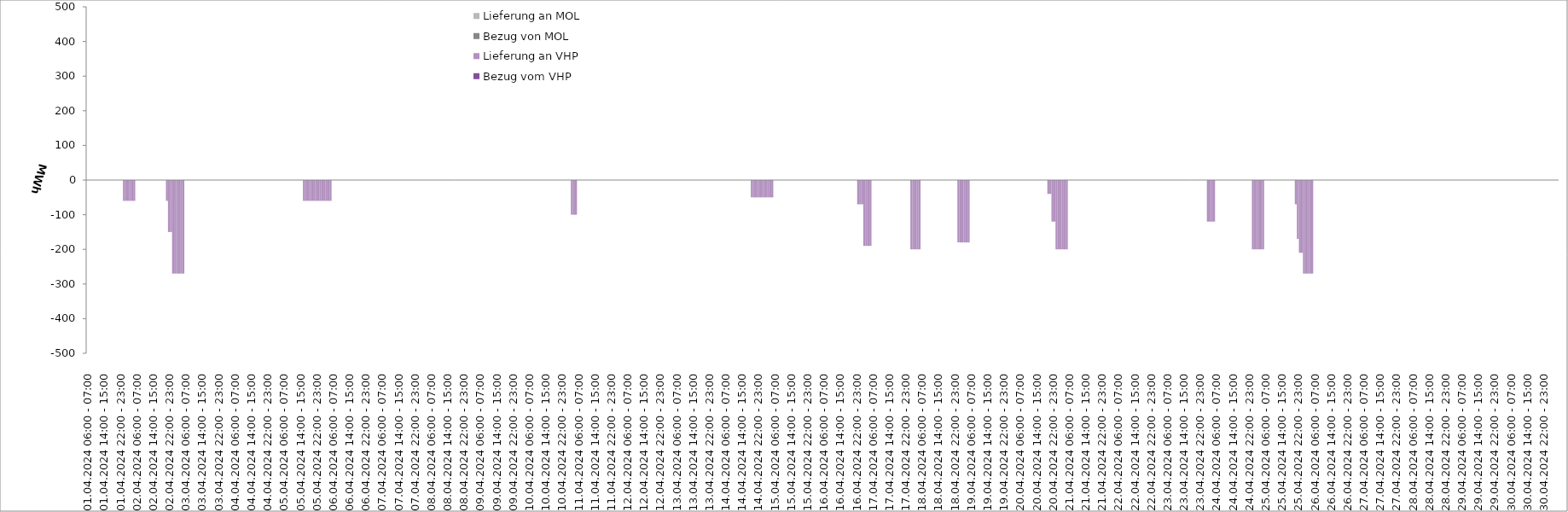
| Category | Bezug vom VHP | Lieferung an VHP | Bezug von MOL | Lieferung an MOL |
|---|---|---|---|---|
| 01.04.2024 06:00 - 07:00 | 0 | 0 | 0 | 0 |
| 01.04.2024 07:00 - 08:00 | 0 | 0 | 0 | 0 |
| 01.04.2024 08:00 - 09:00 | 0 | 0 | 0 | 0 |
| 01.04.2024 09:00 - 10:00 | 0 | 0 | 0 | 0 |
| 01.04.2024 10:00 - 11:00 | 0 | 0 | 0 | 0 |
| 01.04.2024 11:00 - 12:00 | 0 | 0 | 0 | 0 |
| 01.04.2024 12:00 - 13:00 | 0 | 0 | 0 | 0 |
| 01.04.2024 13:00 - 14:00 | 0 | 0 | 0 | 0 |
| 01.04.2024 14:00 - 15:00 | 0 | 0 | 0 | 0 |
| 01.04.2024 15:00 - 16:00 | 0 | 0 | 0 | 0 |
| 01.04.2024 16:00 - 17:00 | 0 | 0 | 0 | 0 |
| 01.04.2024 17:00 - 18:00 | 0 | 0 | 0 | 0 |
| 01.04.2024 18:00 - 19:00 | 0 | 0 | 0 | 0 |
| 01.04.2024 19:00 - 20:00 | 0 | 0 | 0 | 0 |
| 01.04.2024 20:00 - 21:00 | 0 | 0 | 0 | 0 |
| 01.04.2024 21:00 - 22:00 | 0 | 0 | 0 | 0 |
| 01.04.2024 22:00 - 23:00 | 0 | 0 | 0 | 0 |
| 01.04.2024 23:00 - 24:00 | 0 | 0 | 0 | 0 |
| 02.04.2024 00:00 - 01:00 | 0 | -60 | 0 | 0 |
| 02.04.2024 01:00 - 02:00 | 0 | -60 | 0 | 0 |
| 02.04.2024 02:00 - 03:00 | 0 | -60 | 0 | 0 |
| 02.04.2024 03:00 - 04:00 | 0 | -60 | 0 | 0 |
| 02.04.2024 04:00 - 05:00 | 0 | -60 | 0 | 0 |
| 02.04.2024 05:00 - 06:00 | 0 | -60 | 0 | 0 |
| 02.04.2024 06:00 - 07:00 | 0 | 0 | 0 | 0 |
| 02.04.2024 07:00 - 08:00 | 0 | 0 | 0 | 0 |
| 02.04.2024 08:00 - 09:00 | 0 | 0 | 0 | 0 |
| 02.04.2024 09:00 - 10:00 | 0 | 0 | 0 | 0 |
| 02.04.2024 10:00 - 11:00 | 0 | 0 | 0 | 0 |
| 02.04.2024 11:00 - 12:00 | 0 | 0 | 0 | 0 |
| 02.04.2024 12:00 - 13:00 | 0 | 0 | 0 | 0 |
| 02.04.2024 13:00 - 14:00 | 0 | 0 | 0 | 0 |
| 02.04.2024 14:00 - 15:00 | 0 | 0 | 0 | 0 |
| 02.04.2024 15:00 - 16:00 | 0 | 0 | 0 | 0 |
| 02.04.2024 16:00 - 17:00 | 0 | 0 | 0 | 0 |
| 02.04.2024 17:00 - 18:00 | 0 | 0 | 0 | 0 |
| 02.04.2024 18:00 - 19:00 | 0 | 0 | 0 | 0 |
| 02.04.2024 19:00 - 20:00 | 0 | 0 | 0 | 0 |
| 02.04.2024 20:00 - 21:00 | 0 | 0 | 0 | 0 |
| 02.04.2024 21:00 - 22:00 | 0 | -60 | 0 | 0 |
| 02.04.2024 22:00 - 23:00 | 0 | -150 | 0 | 0 |
| 02.04.2024 23:00 - 24:00 | 0 | -150 | 0 | 0 |
| 03.04.2024 00:00 - 01:00 | 0 | -270 | 0 | 0 |
| 03.04.2024 01:00 - 02:00 | 0 | -270 | 0 | 0 |
| 03.04.2024 02:00 - 03:00 | 0 | -270 | 0 | 0 |
| 03.04.2024 03:00 - 04:00 | 0 | -270 | 0 | 0 |
| 03.04.2024 04:00 - 05:00 | 0 | -270 | 0 | 0 |
| 03.04.2024 05:00 - 06:00 | 0 | -270 | 0 | 0 |
| 03.04.2024 06:00 - 07:00 | 0 | 0 | 0 | 0 |
| 03.04.2024 07:00 - 08:00 | 0 | 0 | 0 | 0 |
| 03.04.2024 08:00 - 09:00 | 0 | 0 | 0 | 0 |
| 03.04.2024 09:00 - 10:00 | 0 | 0 | 0 | 0 |
| 03.04.2024 10:00 - 11:00 | 0 | 0 | 0 | 0 |
| 03.04.2024 11:00 - 12:00 | 0 | 0 | 0 | 0 |
| 03.04.2024 12:00 - 13:00 | 0 | 0 | 0 | 0 |
| 03.04.2024 13:00 - 14:00 | 0 | 0 | 0 | 0 |
| 03.04.2024 14:00 - 15:00 | 0 | 0 | 0 | 0 |
| 03.04.2024 15:00 - 16:00 | 0 | 0 | 0 | 0 |
| 03.04.2024 16:00 - 17:00 | 0 | 0 | 0 | 0 |
| 03.04.2024 17:00 - 18:00 | 0 | 0 | 0 | 0 |
| 03.04.2024 18:00 - 19:00 | 0 | 0 | 0 | 0 |
| 03.04.2024 19:00 - 20:00 | 0 | 0 | 0 | 0 |
| 03.04.2024 20:00 - 21:00 | 0 | 0 | 0 | 0 |
| 03.04.2024 21:00 - 22:00 | 0 | 0 | 0 | 0 |
| 03.04.2024 22:00 - 23:00 | 0 | 0 | 0 | 0 |
| 03.04.2024 23:00 - 24:00 | 0 | 0 | 0 | 0 |
| 04.04.2024 00:00 - 01:00 | 0 | 0 | 0 | 0 |
| 04.04.2024 01:00 - 02:00 | 0 | 0 | 0 | 0 |
| 04.04.2024 02:00 - 03:00 | 0 | 0 | 0 | 0 |
| 04.04.2024 03:00 - 04:00 | 0 | 0 | 0 | 0 |
| 04.04.2024 04:00 - 05:00 | 0 | 0 | 0 | 0 |
| 04.04.2024 05:00 - 06:00 | 0 | 0 | 0 | 0 |
| 04.04.2024 06:00 - 07:00 | 0 | 0 | 0 | 0 |
| 04.04.2024 07:00 - 08:00 | 0 | 0 | 0 | 0 |
| 04.04.2024 08:00 - 09:00 | 0 | 0 | 0 | 0 |
| 04.04.2024 09:00 - 10:00 | 0 | 0 | 0 | 0 |
| 04.04.2024 10:00 - 11:00 | 0 | 0 | 0 | 0 |
| 04.04.2024 11:00 - 12:00 | 0 | 0 | 0 | 0 |
| 04.04.2024 12:00 - 13:00 | 0 | 0 | 0 | 0 |
| 04.04.2024 13:00 - 14:00 | 0 | 0 | 0 | 0 |
| 04.04.2024 14:00 - 15:00 | 0 | 0 | 0 | 0 |
| 04.04.2024 15:00 - 16:00 | 0 | 0 | 0 | 0 |
| 04.04.2024 16:00 - 17:00 | 0 | 0 | 0 | 0 |
| 04.04.2024 17:00 - 18:00 | 0 | 0 | 0 | 0 |
| 04.04.2024 18:00 - 19:00 | 0 | 0 | 0 | 0 |
| 04.04.2024 19:00 - 20:00 | 0 | 0 | 0 | 0 |
| 04.04.2024 20:00 - 21:00 | 0 | 0 | 0 | 0 |
| 04.04.2024 21:00 - 22:00 | 0 | 0 | 0 | 0 |
| 04.04.2024 22:00 - 23:00 | 0 | 0 | 0 | 0 |
| 04.04.2024 23:00 - 24:00 | 0 | 0 | 0 | 0 |
| 05.04.2024 00:00 - 01:00 | 0 | 0 | 0 | 0 |
| 05.04.2024 01:00 - 02:00 | 0 | 0 | 0 | 0 |
| 05.04.2024 02:00 - 03:00 | 0 | 0 | 0 | 0 |
| 05.04.2024 03:00 - 04:00 | 0 | 0 | 0 | 0 |
| 05.04.2024 04:00 - 05:00 | 0 | 0 | 0 | 0 |
| 05.04.2024 05:00 - 06:00 | 0 | 0 | 0 | 0 |
| 05.04.2024 06:00 - 07:00 | 0 | 0 | 0 | 0 |
| 05.04.2024 07:00 - 08:00 | 0 | 0 | 0 | 0 |
| 05.04.2024 08:00 - 09:00 | 0 | 0 | 0 | 0 |
| 05.04.2024 09:00 - 10:00 | 0 | 0 | 0 | 0 |
| 05.04.2024 10:00 - 11:00 | 0 | 0 | 0 | 0 |
| 05.04.2024 11:00 - 12:00 | 0 | 0 | 0 | 0 |
| 05.04.2024 12:00 - 13:00 | 0 | 0 | 0 | 0 |
| 05.04.2024 13:00 - 14:00 | 0 | 0 | 0 | 0 |
| 05.04.2024 14:00 - 15:00 | 0 | 0 | 0 | 0 |
| 05.04.2024 15:00 - 16:00 | 0 | 0 | 0 | 0 |
| 05.04.2024 16:00 - 17:00 | 0 | -60 | 0 | 0 |
| 05.04.2024 17:00 - 18:00 | 0 | -60 | 0 | 0 |
| 05.04.2024 18:00 - 19:00 | 0 | -60 | 0 | 0 |
| 05.04.2024 19:00 - 20:00 | 0 | -60 | 0 | 0 |
| 05.04.2024 20:00 - 21:00 | 0 | -60 | 0 | 0 |
| 05.04.2024 21:00 - 22:00 | 0 | -60 | 0 | 0 |
| 05.04.2024 22:00 - 23:00 | 0 | -60 | 0 | 0 |
| 05.04.2024 23:00 - 24:00 | 0 | -60 | 0 | 0 |
| 06.04.2024 00:00 - 01:00 | 0 | -60 | 0 | 0 |
| 06.04.2024 01:00 - 02:00 | 0 | -60 | 0 | 0 |
| 06.04.2024 02:00 - 03:00 | 0 | -60 | 0 | 0 |
| 06.04.2024 03:00 - 04:00 | 0 | -60 | 0 | 0 |
| 06.04.2024 04:00 - 05:00 | 0 | -60 | 0 | 0 |
| 06.04.2024 05:00 - 06:00 | 0 | -60 | 0 | 0 |
| 06.04.2024 06:00 - 07:00 | 0 | 0 | 0 | 0 |
| 06.04.2024 07:00 - 08:00 | 0 | 0 | 0 | 0 |
| 06.04.2024 08:00 - 09:00 | 0 | 0 | 0 | 0 |
| 06.04.2024 09:00 - 10:00 | 0 | 0 | 0 | 0 |
| 06.04.2024 10:00 - 11:00 | 0 | 0 | 0 | 0 |
| 06.04.2024 11:00 - 12:00 | 0 | 0 | 0 | 0 |
| 06.04.2024 12:00 - 13:00 | 0 | 0 | 0 | 0 |
| 06.04.2024 13:00 - 14:00 | 0 | 0 | 0 | 0 |
| 06.04.2024 14:00 - 15:00 | 0 | 0 | 0 | 0 |
| 06.04.2024 15:00 - 16:00 | 0 | 0 | 0 | 0 |
| 06.04.2024 16:00 - 17:00 | 0 | 0 | 0 | 0 |
| 06.04.2024 17:00 - 18:00 | 0 | 0 | 0 | 0 |
| 06.04.2024 18:00 - 19:00 | 0 | 0 | 0 | 0 |
| 06.04.2024 19:00 - 20:00 | 0 | 0 | 0 | 0 |
| 06.04.2024 20:00 - 21:00 | 0 | 0 | 0 | 0 |
| 06.04.2024 21:00 - 22:00 | 0 | 0 | 0 | 0 |
| 06.04.2024 22:00 - 23:00 | 0 | 0 | 0 | 0 |
| 06.04.2024 23:00 - 24:00 | 0 | 0 | 0 | 0 |
| 07.04.2024 00:00 - 01:00 | 0 | 0 | 0 | 0 |
| 07.04.2024 01:00 - 02:00 | 0 | 0 | 0 | 0 |
| 07.04.2024 02:00 - 03:00 | 0 | 0 | 0 | 0 |
| 07.04.2024 03:00 - 04:00 | 0 | 0 | 0 | 0 |
| 07.04.2024 04:00 - 05:00 | 0 | 0 | 0 | 0 |
| 07.04.2024 05:00 - 06:00 | 0 | 0 | 0 | 0 |
| 07.04.2024 06:00 - 07:00 | 0 | 0 | 0 | 0 |
| 07.04.2024 07:00 - 08:00 | 0 | 0 | 0 | 0 |
| 07.04.2024 08:00 - 09:00 | 0 | 0 | 0 | 0 |
| 07.04.2024 09:00 - 10:00 | 0 | 0 | 0 | 0 |
| 07.04.2024 10:00 - 11:00 | 0 | 0 | 0 | 0 |
| 07.04.2024 11:00 - 12:00 | 0 | 0 | 0 | 0 |
| 07.04.2024 12:00 - 13:00 | 0 | 0 | 0 | 0 |
| 07.04.2024 13:00 - 14:00 | 0 | 0 | 0 | 0 |
| 07.04.2024 14:00 - 15:00 | 0 | 0 | 0 | 0 |
| 07.04.2024 15:00 - 16:00 | 0 | 0 | 0 | 0 |
| 07.04.2024 16:00 - 17:00 | 0 | 0 | 0 | 0 |
| 07.04.2024 17:00 - 18:00 | 0 | 0 | 0 | 0 |
| 07.04.2024 18:00 - 19:00 | 0 | 0 | 0 | 0 |
| 07.04.2024 19:00 - 20:00 | 0 | 0 | 0 | 0 |
| 07.04.2024 20:00 - 21:00 | 0 | 0 | 0 | 0 |
| 07.04.2024 21:00 - 22:00 | 0 | 0 | 0 | 0 |
| 07.04.2024 22:00 - 23:00 | 0 | 0 | 0 | 0 |
| 07.04.2024 23:00 - 24:00 | 0 | 0 | 0 | 0 |
| 08.04.2024 00:00 - 01:00 | 0 | 0 | 0 | 0 |
| 08.04.2024 01:00 - 02:00 | 0 | 0 | 0 | 0 |
| 08.04.2024 02:00 - 03:00 | 0 | 0 | 0 | 0 |
| 08.04.2024 03:00 - 04:00 | 0 | 0 | 0 | 0 |
| 08.04.2024 04:00 - 05:00 | 0 | 0 | 0 | 0 |
| 08.04.2024 05:00 - 06:00 | 0 | 0 | 0 | 0 |
| 08.04.2024 06:00 - 07:00 | 0 | 0 | 0 | 0 |
| 08.04.2024 07:00 - 08:00 | 0 | 0 | 0 | 0 |
| 08.04.2024 08:00 - 09:00 | 0 | 0 | 0 | 0 |
| 08.04.2024 09:00 - 10:00 | 0 | 0 | 0 | 0 |
| 08.04.2024 10:00 - 11:00 | 0 | 0 | 0 | 0 |
| 08.04.2024 11:00 - 12:00 | 0 | 0 | 0 | 0 |
| 08.04.2024 12:00 - 13:00 | 0 | 0 | 0 | 0 |
| 08.04.2024 13:00 - 14:00 | 0 | 0 | 0 | 0 |
| 08.04.2024 14:00 - 15:00 | 0 | 0 | 0 | 0 |
| 08.04.2024 15:00 - 16:00 | 0 | 0 | 0 | 0 |
| 08.04.2024 16:00 - 17:00 | 0 | 0 | 0 | 0 |
| 08.04.2024 17:00 - 18:00 | 0 | 0 | 0 | 0 |
| 08.04.2024 18:00 - 19:00 | 0 | 0 | 0 | 0 |
| 08.04.2024 19:00 - 20:00 | 0 | 0 | 0 | 0 |
| 08.04.2024 20:00 - 21:00 | 0 | 0 | 0 | 0 |
| 08.04.2024 21:00 - 22:00 | 0 | 0 | 0 | 0 |
| 08.04.2024 22:00 - 23:00 | 0 | 0 | 0 | 0 |
| 08.04.2024 23:00 - 24:00 | 0 | 0 | 0 | 0 |
| 09.04.2024 00:00 - 01:00 | 0 | 0 | 0 | 0 |
| 09.04.2024 01:00 - 02:00 | 0 | 0 | 0 | 0 |
| 09.04.2024 02:00 - 03:00 | 0 | 0 | 0 | 0 |
| 09.04.2024 03:00 - 04:00 | 0 | 0 | 0 | 0 |
| 09.04.2024 04:00 - 05:00 | 0 | 0 | 0 | 0 |
| 09.04.2024 05:00 - 06:00 | 0 | 0 | 0 | 0 |
| 09.04.2024 06:00 - 07:00 | 0 | 0 | 0 | 0 |
| 09.04.2024 07:00 - 08:00 | 0 | 0 | 0 | 0 |
| 09.04.2024 08:00 - 09:00 | 0 | 0 | 0 | 0 |
| 09.04.2024 09:00 - 10:00 | 0 | 0 | 0 | 0 |
| 09.04.2024 10:00 - 11:00 | 0 | 0 | 0 | 0 |
| 09.04.2024 11:00 - 12:00 | 0 | 0 | 0 | 0 |
| 09.04.2024 12:00 - 13:00 | 0 | 0 | 0 | 0 |
| 09.04.2024 13:00 - 14:00 | 0 | 0 | 0 | 0 |
| 09.04.2024 14:00 - 15:00 | 0 | 0 | 0 | 0 |
| 09.04.2024 15:00 - 16:00 | 0 | 0 | 0 | 0 |
| 09.04.2024 16:00 - 17:00 | 0 | 0 | 0 | 0 |
| 09.04.2024 17:00 - 18:00 | 0 | 0 | 0 | 0 |
| 09.04.2024 18:00 - 19:00 | 0 | 0 | 0 | 0 |
| 09.04.2024 19:00 - 20:00 | 0 | 0 | 0 | 0 |
| 09.04.2024 20:00 - 21:00 | 0 | 0 | 0 | 0 |
| 09.04.2024 21:00 - 22:00 | 0 | 0 | 0 | 0 |
| 09.04.2024 22:00 - 23:00 | 0 | 0 | 0 | 0 |
| 09.04.2024 23:00 - 24:00 | 0 | 0 | 0 | 0 |
| 10.04.2024 00:00 - 01:00 | 0 | 0 | 0 | 0 |
| 10.04.2024 01:00 - 02:00 | 0 | 0 | 0 | 0 |
| 10.04.2024 02:00 - 03:00 | 0 | 0 | 0 | 0 |
| 10.04.2024 03:00 - 04:00 | 0 | 0 | 0 | 0 |
| 10.04.2024 04:00 - 05:00 | 0 | 0 | 0 | 0 |
| 10.04.2024 05:00 - 06:00 | 0 | 0 | 0 | 0 |
| 10.04.2024 06:00 - 07:00 | 0 | 0 | 0 | 0 |
| 10.04.2024 07:00 - 08:00 | 0 | 0 | 0 | 0 |
| 10.04.2024 08:00 - 09:00 | 0 | 0 | 0 | 0 |
| 10.04.2024 09:00 - 10:00 | 0 | 0 | 0 | 0 |
| 10.04.2024 10:00 - 11:00 | 0 | 0 | 0 | 0 |
| 10.04.2024 11:00 - 12:00 | 0 | 0 | 0 | 0 |
| 10.04.2024 12:00 - 13:00 | 0 | 0 | 0 | 0 |
| 10.04.2024 13:00 - 14:00 | 0 | 0 | 0 | 0 |
| 10.04.2024 14:00 - 15:00 | 0 | 0 | 0 | 0 |
| 10.04.2024 15:00 - 16:00 | 0 | 0 | 0 | 0 |
| 10.04.2024 16:00 - 17:00 | 0 | 0 | 0 | 0 |
| 10.04.2024 17:00 - 18:00 | 0 | 0 | 0 | 0 |
| 10.04.2024 18:00 - 19:00 | 0 | 0 | 0 | 0 |
| 10.04.2024 19:00 - 20:00 | 0 | 0 | 0 | 0 |
| 10.04.2024 20:00 - 21:00 | 0 | 0 | 0 | 0 |
| 10.04.2024 21:00 - 22:00 | 0 | 0 | 0 | 0 |
| 10.04.2024 22:00 - 23:00 | 0 | 0 | 0 | 0 |
| 10.04.2024 23:00 - 24:00 | 0 | 0 | 0 | 0 |
| 11.04.2024 00:00 - 01:00 | 0 | 0 | 0 | 0 |
| 11.04.2024 01:00 - 02:00 | 0 | 0 | 0 | 0 |
| 11.04.2024 02:00 - 03:00 | 0 | 0 | 0 | 0 |
| 11.04.2024 03:00 - 04:00 | 0 | -100 | 0 | 0 |
| 11.04.2024 04:00 - 05:00 | 0 | -100 | 0 | 0 |
| 11.04.2024 05:00 - 06:00 | 0 | -100 | 0 | 0 |
| 11.04.2024 06:00 - 07:00 | 0 | 0 | 0 | 0 |
| 11.04.2024 07:00 - 08:00 | 0 | 0 | 0 | 0 |
| 11.04.2024 08:00 - 09:00 | 0 | 0 | 0 | 0 |
| 11.04.2024 09:00 - 10:00 | 0 | 0 | 0 | 0 |
| 11.04.2024 10:00 - 11:00 | 0 | 0 | 0 | 0 |
| 11.04.2024 11:00 - 12:00 | 0 | 0 | 0 | 0 |
| 11.04.2024 12:00 - 13:00 | 0 | 0 | 0 | 0 |
| 11.04.2024 13:00 - 14:00 | 0 | 0 | 0 | 0 |
| 11.04.2024 14:00 - 15:00 | 0 | 0 | 0 | 0 |
| 11.04.2024 15:00 - 16:00 | 0 | 0 | 0 | 0 |
| 11.04.2024 16:00 - 17:00 | 0 | 0 | 0 | 0 |
| 11.04.2024 17:00 - 18:00 | 0 | 0 | 0 | 0 |
| 11.04.2024 18:00 - 19:00 | 0 | 0 | 0 | 0 |
| 11.04.2024 19:00 - 20:00 | 0 | 0 | 0 | 0 |
| 11.04.2024 20:00 - 21:00 | 0 | 0 | 0 | 0 |
| 11.04.2024 21:00 - 22:00 | 0 | 0 | 0 | 0 |
| 11.04.2024 22:00 - 23:00 | 0 | 0 | 0 | 0 |
| 11.04.2024 23:00 - 24:00 | 0 | 0 | 0 | 0 |
| 12.04.2024 00:00 - 01:00 | 0 | 0 | 0 | 0 |
| 12.04.2024 01:00 - 02:00 | 0 | 0 | 0 | 0 |
| 12.04.2024 02:00 - 03:00 | 0 | 0 | 0 | 0 |
| 12.04.2024 03:00 - 04:00 | 0 | 0 | 0 | 0 |
| 12.04.2024 04:00 - 05:00 | 0 | 0 | 0 | 0 |
| 12.04.2024 05:00 - 06:00 | 0 | 0 | 0 | 0 |
| 12.04.2024 06:00 - 07:00 | 0 | 0 | 0 | 0 |
| 12.04.2024 07:00 - 08:00 | 0 | 0 | 0 | 0 |
| 12.04.2024 08:00 - 09:00 | 0 | 0 | 0 | 0 |
| 12.04.2024 09:00 - 10:00 | 0 | 0 | 0 | 0 |
| 12.04.2024 10:00 - 11:00 | 0 | 0 | 0 | 0 |
| 12.04.2024 11:00 - 12:00 | 0 | 0 | 0 | 0 |
| 12.04.2024 12:00 - 13:00 | 0 | 0 | 0 | 0 |
| 12.04.2024 13:00 - 14:00 | 0 | 0 | 0 | 0 |
| 12.04.2024 14:00 - 15:00 | 0 | 0 | 0 | 0 |
| 12.04.2024 15:00 - 16:00 | 0 | 0 | 0 | 0 |
| 12.04.2024 16:00 - 17:00 | 0 | 0 | 0 | 0 |
| 12.04.2024 17:00 - 18:00 | 0 | 0 | 0 | 0 |
| 12.04.2024 18:00 - 19:00 | 0 | 0 | 0 | 0 |
| 12.04.2024 19:00 - 20:00 | 0 | 0 | 0 | 0 |
| 12.04.2024 20:00 - 21:00 | 0 | 0 | 0 | 0 |
| 12.04.2024 21:00 - 22:00 | 0 | 0 | 0 | 0 |
| 12.04.2024 22:00 - 23:00 | 0 | 0 | 0 | 0 |
| 12.04.2024 23:00 - 24:00 | 0 | 0 | 0 | 0 |
| 13.04.2024 00:00 - 01:00 | 0 | 0 | 0 | 0 |
| 13.04.2024 01:00 - 02:00 | 0 | 0 | 0 | 0 |
| 13.04.2024 02:00 - 03:00 | 0 | 0 | 0 | 0 |
| 13.04.2024 03:00 - 04:00 | 0 | 0 | 0 | 0 |
| 13.04.2024 04:00 - 05:00 | 0 | 0 | 0 | 0 |
| 13.04.2024 05:00 - 06:00 | 0 | 0 | 0 | 0 |
| 13.04.2024 06:00 - 07:00 | 0 | 0 | 0 | 0 |
| 13.04.2024 07:00 - 08:00 | 0 | 0 | 0 | 0 |
| 13.04.2024 08:00 - 09:00 | 0 | 0 | 0 | 0 |
| 13.04.2024 09:00 - 10:00 | 0 | 0 | 0 | 0 |
| 13.04.2024 10:00 - 11:00 | 0 | 0 | 0 | 0 |
| 13.04.2024 11:00 - 12:00 | 0 | 0 | 0 | 0 |
| 13.04.2024 12:00 - 13:00 | 0 | 0 | 0 | 0 |
| 13.04.2024 13:00 - 14:00 | 0 | 0 | 0 | 0 |
| 13.04.2024 14:00 - 15:00 | 0 | 0 | 0 | 0 |
| 13.04.2024 15:00 - 16:00 | 0 | 0 | 0 | 0 |
| 13.04.2024 16:00 - 17:00 | 0 | 0 | 0 | 0 |
| 13.04.2024 17:00 - 18:00 | 0 | 0 | 0 | 0 |
| 13.04.2024 18:00 - 19:00 | 0 | 0 | 0 | 0 |
| 13.04.2024 19:00 - 20:00 | 0 | 0 | 0 | 0 |
| 13.04.2024 20:00 - 21:00 | 0 | 0 | 0 | 0 |
| 13.04.2024 21:00 - 22:00 | 0 | 0 | 0 | 0 |
| 13.04.2024 22:00 - 23:00 | 0 | 0 | 0 | 0 |
| 13.04.2024 23:00 - 24:00 | 0 | 0 | 0 | 0 |
| 14.04.2024 00:00 - 01:00 | 0 | 0 | 0 | 0 |
| 14.04.2024 01:00 - 02:00 | 0 | 0 | 0 | 0 |
| 14.04.2024 02:00 - 03:00 | 0 | 0 | 0 | 0 |
| 14.04.2024 03:00 - 04:00 | 0 | 0 | 0 | 0 |
| 14.04.2024 04:00 - 05:00 | 0 | 0 | 0 | 0 |
| 14.04.2024 05:00 - 06:00 | 0 | 0 | 0 | 0 |
| 14.04.2024 06:00 - 07:00 | 0 | 0 | 0 | 0 |
| 14.04.2024 07:00 - 08:00 | 0 | 0 | 0 | 0 |
| 14.04.2024 08:00 - 09:00 | 0 | 0 | 0 | 0 |
| 14.04.2024 09:00 - 10:00 | 0 | 0 | 0 | 0 |
| 14.04.2024 10:00 - 11:00 | 0 | 0 | 0 | 0 |
| 14.04.2024 11:00 - 12:00 | 0 | 0 | 0 | 0 |
| 14.04.2024 12:00 - 13:00 | 0 | 0 | 0 | 0 |
| 14.04.2024 13:00 - 14:00 | 0 | 0 | 0 | 0 |
| 14.04.2024 14:00 - 15:00 | 0 | 0 | 0 | 0 |
| 14.04.2024 15:00 - 16:00 | 0 | 0 | 0 | 0 |
| 14.04.2024 16:00 - 17:00 | 0 | 0 | 0 | 0 |
| 14.04.2024 17:00 - 18:00 | 0 | 0 | 0 | 0 |
| 14.04.2024 18:00 - 19:00 | 0 | 0 | 0 | 0 |
| 14.04.2024 19:00 - 20:00 | 0 | -50 | 0 | 0 |
| 14.04.2024 20:00 - 21:00 | 0 | -50 | 0 | 0 |
| 14.04.2024 21:00 - 22:00 | 0 | -50 | 0 | 0 |
| 14.04.2024 22:00 - 23:00 | 0 | -50 | 0 | 0 |
| 14.04.2024 23:00 - 24:00 | 0 | -50 | 0 | 0 |
| 15.04.2024 00:00 - 01:00 | 0 | -50 | 0 | 0 |
| 15.04.2024 01:00 - 02:00 | 0 | -50 | 0 | 0 |
| 15.04.2024 02:00 - 03:00 | 0 | -50 | 0 | 0 |
| 15.04.2024 03:00 - 04:00 | 0 | -50 | 0 | 0 |
| 15.04.2024 04:00 - 05:00 | 0 | -50 | 0 | 0 |
| 15.04.2024 05:00 - 06:00 | 0 | -50 | 0 | 0 |
| 15.04.2024 06:00 - 07:00 | 0 | 0 | 0 | 0 |
| 15.04.2024 07:00 - 08:00 | 0 | 0 | 0 | 0 |
| 15.04.2024 08:00 - 09:00 | 0 | 0 | 0 | 0 |
| 15.04.2024 09:00 - 10:00 | 0 | 0 | 0 | 0 |
| 15.04.2024 10:00 - 11:00 | 0 | 0 | 0 | 0 |
| 15.04.2024 11:00 - 12:00 | 0 | 0 | 0 | 0 |
| 15.04.2024 12:00 - 13:00 | 0 | 0 | 0 | 0 |
| 15.04.2024 13:00 - 14:00 | 0 | 0 | 0 | 0 |
| 15.04.2024 14:00 - 15:00 | 0 | 0 | 0 | 0 |
| 15.04.2024 15:00 - 16:00 | 0 | 0 | 0 | 0 |
| 15.04.2024 16:00 - 17:00 | 0 | 0 | 0 | 0 |
| 15.04.2024 17:00 - 18:00 | 0 | 0 | 0 | 0 |
| 15.04.2024 18:00 - 19:00 | 0 | 0 | 0 | 0 |
| 15.04.2024 19:00 - 20:00 | 0 | 0 | 0 | 0 |
| 15.04.2024 20:00 - 21:00 | 0 | 0 | 0 | 0 |
| 15.04.2024 21:00 - 22:00 | 0 | 0 | 0 | 0 |
| 15.04.2024 22:00 - 23:00 | 0 | 0 | 0 | 0 |
| 15.04.2024 23:00 - 24:00 | 0 | 0 | 0 | 0 |
| 16.04.2024 00:00 - 01:00 | 0 | 0 | 0 | 0 |
| 16.04.2024 01:00 - 02:00 | 0 | 0 | 0 | 0 |
| 16.04.2024 02:00 - 03:00 | 0 | 0 | 0 | 0 |
| 16.04.2024 03:00 - 04:00 | 0 | 0 | 0 | 0 |
| 16.04.2024 04:00 - 05:00 | 0 | 0 | 0 | 0 |
| 16.04.2024 05:00 - 06:00 | 0 | 0 | 0 | 0 |
| 16.04.2024 06:00 - 07:00 | 0 | 0 | 0 | 0 |
| 16.04.2024 07:00 - 08:00 | 0 | 0 | 0 | 0 |
| 16.04.2024 08:00 - 09:00 | 0 | 0 | 0 | 0 |
| 16.04.2024 09:00 - 10:00 | 0 | 0 | 0 | 0 |
| 16.04.2024 10:00 - 11:00 | 0 | 0 | 0 | 0 |
| 16.04.2024 11:00 - 12:00 | 0 | 0 | 0 | 0 |
| 16.04.2024 12:00 - 13:00 | 0 | 0 | 0 | 0 |
| 16.04.2024 13:00 - 14:00 | 0 | 0 | 0 | 0 |
| 16.04.2024 14:00 - 15:00 | 0 | 0 | 0 | 0 |
| 16.04.2024 15:00 - 16:00 | 0 | 0 | 0 | 0 |
| 16.04.2024 16:00 - 17:00 | 0 | 0 | 0 | 0 |
| 16.04.2024 17:00 - 18:00 | 0 | 0 | 0 | 0 |
| 16.04.2024 18:00 - 19:00 | 0 | 0 | 0 | 0 |
| 16.04.2024 19:00 - 20:00 | 0 | 0 | 0 | 0 |
| 16.04.2024 20:00 - 21:00 | 0 | 0 | 0 | 0 |
| 16.04.2024 21:00 - 22:00 | 0 | 0 | 0 | 0 |
| 16.04.2024 22:00 - 23:00 | 0 | 0 | 0 | 0 |
| 16.04.2024 23:00 - 24:00 | 0 | -70 | 0 | 0 |
| 17.04.2024 00:00 - 01:00 | 0 | -70 | 0 | 0 |
| 17.04.2024 01:00 - 02:00 | 0 | -70 | 0 | 0 |
| 17.04.2024 02:00 - 03:00 | 0 | -190 | 0 | 0 |
| 17.04.2024 03:00 - 04:00 | 0 | -190 | 0 | 0 |
| 17.04.2024 04:00 - 05:00 | 0 | -190 | 0 | 0 |
| 17.04.2024 05:00 - 06:00 | 0 | -190 | 0 | 0 |
| 17.04.2024 06:00 - 07:00 | 0 | 0 | 0 | 0 |
| 17.04.2024 07:00 - 08:00 | 0 | 0 | 0 | 0 |
| 17.04.2024 08:00 - 09:00 | 0 | 0 | 0 | 0 |
| 17.04.2024 09:00 - 10:00 | 0 | 0 | 0 | 0 |
| 17.04.2024 10:00 - 11:00 | 0 | 0 | 0 | 0 |
| 17.04.2024 11:00 - 12:00 | 0 | 0 | 0 | 0 |
| 17.04.2024 12:00 - 13:00 | 0 | 0 | 0 | 0 |
| 17.04.2024 13:00 - 14:00 | 0 | 0 | 0 | 0 |
| 17.04.2024 14:00 - 15:00 | 0 | 0 | 0 | 0 |
| 17.04.2024 15:00 - 16:00 | 0 | 0 | 0 | 0 |
| 17.04.2024 16:00 - 17:00 | 0 | 0 | 0 | 0 |
| 17.04.2024 17:00 - 18:00 | 0 | 0 | 0 | 0 |
| 17.04.2024 18:00 - 19:00 | 0 | 0 | 0 | 0 |
| 17.04.2024 19:00 - 20:00 | 0 | 0 | 0 | 0 |
| 17.04.2024 20:00 - 21:00 | 0 | 0 | 0 | 0 |
| 17.04.2024 21:00 - 22:00 | 0 | 0 | 0 | 0 |
| 17.04.2024 22:00 - 23:00 | 0 | 0 | 0 | 0 |
| 17.04.2024 23:00 - 24:00 | 0 | 0 | 0 | 0 |
| 18.04.2024 00:00 - 01:00 | 0 | 0 | 0 | 0 |
| 18.04.2024 01:00 - 02:00 | 0 | -200 | 0 | 0 |
| 18.04.2024 02:00 - 03:00 | 0 | -200 | 0 | 0 |
| 18.04.2024 03:00 - 04:00 | 0 | -200 | 0 | 0 |
| 18.04.2024 04:00 - 05:00 | 0 | -200 | 0 | 0 |
| 18.04.2024 05:00 - 06:00 | 0 | -200 | 0 | 0 |
| 18.04.2024 06:00 - 07:00 | 0 | 0 | 0 | 0 |
| 18.04.2024 07:00 - 08:00 | 0 | 0 | 0 | 0 |
| 18.04.2024 08:00 - 09:00 | 0 | 0 | 0 | 0 |
| 18.04.2024 09:00 - 10:00 | 0 | 0 | 0 | 0 |
| 18.04.2024 10:00 - 11:00 | 0 | 0 | 0 | 0 |
| 18.04.2024 11:00 - 12:00 | 0 | 0 | 0 | 0 |
| 18.04.2024 12:00 - 13:00 | 0 | 0 | 0 | 0 |
| 18.04.2024 13:00 - 14:00 | 0 | 0 | 0 | 0 |
| 18.04.2024 14:00 - 15:00 | 0 | 0 | 0 | 0 |
| 18.04.2024 15:00 - 16:00 | 0 | 0 | 0 | 0 |
| 18.04.2024 16:00 - 17:00 | 0 | 0 | 0 | 0 |
| 18.04.2024 17:00 - 18:00 | 0 | 0 | 0 | 0 |
| 18.04.2024 18:00 - 19:00 | 0 | 0 | 0 | 0 |
| 18.04.2024 19:00 - 20:00 | 0 | 0 | 0 | 0 |
| 18.04.2024 20:00 - 21:00 | 0 | 0 | 0 | 0 |
| 18.04.2024 21:00 - 22:00 | 0 | 0 | 0 | 0 |
| 18.04.2024 22:00 - 23:00 | 0 | 0 | 0 | 0 |
| 18.04.2024 23:00 - 24:00 | 0 | 0 | 0 | 0 |
| 19.04.2024 00:00 - 01:00 | 0 | -180 | 0 | 0 |
| 19.04.2024 01:00 - 02:00 | 0 | -180 | 0 | 0 |
| 19.04.2024 02:00 - 03:00 | 0 | -180 | 0 | 0 |
| 19.04.2024 03:00 - 04:00 | 0 | -180 | 0 | 0 |
| 19.04.2024 04:00 - 05:00 | 0 | -180 | 0 | 0 |
| 19.04.2024 05:00 - 06:00 | 0 | -180 | 0 | 0 |
| 19.04.2024 06:00 - 07:00 | 0 | 0 | 0 | 0 |
| 19.04.2024 07:00 - 08:00 | 0 | 0 | 0 | 0 |
| 19.04.2024 08:00 - 09:00 | 0 | 0 | 0 | 0 |
| 19.04.2024 09:00 - 10:00 | 0 | 0 | 0 | 0 |
| 19.04.2024 10:00 - 11:00 | 0 | 0 | 0 | 0 |
| 19.04.2024 11:00 - 12:00 | 0 | 0 | 0 | 0 |
| 19.04.2024 12:00 - 13:00 | 0 | 0 | 0 | 0 |
| 19.04.2024 13:00 - 14:00 | 0 | 0 | 0 | 0 |
| 19.04.2024 14:00 - 15:00 | 0 | 0 | 0 | 0 |
| 19.04.2024 15:00 - 16:00 | 0 | 0 | 0 | 0 |
| 19.04.2024 16:00 - 17:00 | 0 | 0 | 0 | 0 |
| 19.04.2024 17:00 - 18:00 | 0 | 0 | 0 | 0 |
| 19.04.2024 18:00 - 19:00 | 0 | 0 | 0 | 0 |
| 19.04.2024 19:00 - 20:00 | 0 | 0 | 0 | 0 |
| 19.04.2024 20:00 - 21:00 | 0 | 0 | 0 | 0 |
| 19.04.2024 21:00 - 22:00 | 0 | 0 | 0 | 0 |
| 19.04.2024 22:00 - 23:00 | 0 | 0 | 0 | 0 |
| 19.04.2024 23:00 - 24:00 | 0 | 0 | 0 | 0 |
| 20.04.2024 00:00 - 01:00 | 0 | 0 | 0 | 0 |
| 20.04.2024 01:00 - 02:00 | 0 | 0 | 0 | 0 |
| 20.04.2024 02:00 - 03:00 | 0 | 0 | 0 | 0 |
| 20.04.2024 03:00 - 04:00 | 0 | 0 | 0 | 0 |
| 20.04.2024 04:00 - 05:00 | 0 | 0 | 0 | 0 |
| 20.04.2024 05:00 - 06:00 | 0 | 0 | 0 | 0 |
| 20.04.2024 06:00 - 07:00 | 0 | 0 | 0 | 0 |
| 20.04.2024 07:00 - 08:00 | 0 | 0 | 0 | 0 |
| 20.04.2024 08:00 - 09:00 | 0 | 0 | 0 | 0 |
| 20.04.2024 09:00 - 10:00 | 0 | 0 | 0 | 0 |
| 20.04.2024 10:00 - 11:00 | 0 | 0 | 0 | 0 |
| 20.04.2024 11:00 - 12:00 | 0 | 0 | 0 | 0 |
| 20.04.2024 12:00 - 13:00 | 0 | 0 | 0 | 0 |
| 20.04.2024 13:00 - 14:00 | 0 | 0 | 0 | 0 |
| 20.04.2024 14:00 - 15:00 | 0 | 0 | 0 | 0 |
| 20.04.2024 15:00 - 16:00 | 0 | 0 | 0 | 0 |
| 20.04.2024 16:00 - 17:00 | 0 | 0 | 0 | 0 |
| 20.04.2024 17:00 - 18:00 | 0 | 0 | 0 | 0 |
| 20.04.2024 18:00 - 19:00 | 0 | 0 | 0 | 0 |
| 20.04.2024 19:00 - 20:00 | 0 | 0 | 0 | 0 |
| 20.04.2024 20:00 - 21:00 | 0 | -40 | 0 | 0 |
| 20.04.2024 21:00 - 22:00 | 0 | -40 | 0 | 0 |
| 20.04.2024 22:00 - 23:00 | 0 | -120 | 0 | 0 |
| 20.04.2024 23:00 - 24:00 | 0 | -120 | 0 | 0 |
| 21.04.2024 00:00 - 01:00 | 0 | -200 | 0 | 0 |
| 21.04.2024 01:00 - 02:00 | 0 | -200 | 0 | 0 |
| 21.04.2024 02:00 - 03:00 | 0 | -200 | 0 | 0 |
| 21.04.2024 03:00 - 04:00 | 0 | -200 | 0 | 0 |
| 21.04.2024 04:00 - 05:00 | 0 | -200 | 0 | 0 |
| 21.04.2024 05:00 - 06:00 | 0 | -200 | 0 | 0 |
| 21.04.2024 06:00 - 07:00 | 0 | 0 | 0 | 0 |
| 21.04.2024 07:00 - 08:00 | 0 | 0 | 0 | 0 |
| 21.04.2024 08:00 - 09:00 | 0 | 0 | 0 | 0 |
| 21.04.2024 09:00 - 10:00 | 0 | 0 | 0 | 0 |
| 21.04.2024 10:00 - 11:00 | 0 | 0 | 0 | 0 |
| 21.04.2024 11:00 - 12:00 | 0 | 0 | 0 | 0 |
| 21.04.2024 12:00 - 13:00 | 0 | 0 | 0 | 0 |
| 21.04.2024 13:00 - 14:00 | 0 | 0 | 0 | 0 |
| 21.04.2024 14:00 - 15:00 | 0 | 0 | 0 | 0 |
| 21.04.2024 15:00 - 16:00 | 0 | 0 | 0 | 0 |
| 21.04.2024 16:00 - 17:00 | 0 | 0 | 0 | 0 |
| 21.04.2024 17:00 - 18:00 | 0 | 0 | 0 | 0 |
| 21.04.2024 18:00 - 19:00 | 0 | 0 | 0 | 0 |
| 21.04.2024 19:00 - 20:00 | 0 | 0 | 0 | 0 |
| 21.04.2024 20:00 - 21:00 | 0 | 0 | 0 | 0 |
| 21.04.2024 21:00 - 22:00 | 0 | 0 | 0 | 0 |
| 21.04.2024 22:00 - 23:00 | 0 | 0 | 0 | 0 |
| 21.04.2024 23:00 - 24:00 | 0 | 0 | 0 | 0 |
| 22.04.2024 00:00 - 01:00 | 0 | 0 | 0 | 0 |
| 22.04.2024 01:00 - 02:00 | 0 | 0 | 0 | 0 |
| 22.04.2024 02:00 - 03:00 | 0 | 0 | 0 | 0 |
| 22.04.2024 03:00 - 04:00 | 0 | 0 | 0 | 0 |
| 22.04.2024 04:00 - 05:00 | 0 | 0 | 0 | 0 |
| 22.04.2024 05:00 - 06:00 | 0 | 0 | 0 | 0 |
| 22.04.2024 06:00 - 07:00 | 0 | 0 | 0 | 0 |
| 22.04.2024 07:00 - 08:00 | 0 | 0 | 0 | 0 |
| 22.04.2024 08:00 - 09:00 | 0 | 0 | 0 | 0 |
| 22.04.2024 09:00 - 10:00 | 0 | 0 | 0 | 0 |
| 22.04.2024 10:00 - 11:00 | 0 | 0 | 0 | 0 |
| 22.04.2024 11:00 - 12:00 | 0 | 0 | 0 | 0 |
| 22.04.2024 12:00 - 13:00 | 0 | 0 | 0 | 0 |
| 22.04.2024 13:00 - 14:00 | 0 | 0 | 0 | 0 |
| 22.04.2024 14:00 - 15:00 | 0 | 0 | 0 | 0 |
| 22.04.2024 15:00 - 16:00 | 0 | 0 | 0 | 0 |
| 22.04.2024 16:00 - 17:00 | 0 | 0 | 0 | 0 |
| 22.04.2024 17:00 - 18:00 | 0 | 0 | 0 | 0 |
| 22.04.2024 18:00 - 19:00 | 0 | 0 | 0 | 0 |
| 22.04.2024 19:00 - 20:00 | 0 | 0 | 0 | 0 |
| 22.04.2024 20:00 - 21:00 | 0 | 0 | 0 | 0 |
| 22.04.2024 21:00 - 22:00 | 0 | 0 | 0 | 0 |
| 22.04.2024 22:00 - 23:00 | 0 | 0 | 0 | 0 |
| 22.04.2024 23:00 - 24:00 | 0 | 0 | 0 | 0 |
| 23.04.2024 00:00 - 01:00 | 0 | 0 | 0 | 0 |
| 23.04.2024 01:00 - 02:00 | 0 | 0 | 0 | 0 |
| 23.04.2024 02:00 - 03:00 | 0 | 0 | 0 | 0 |
| 23.04.2024 03:00 - 04:00 | 0 | 0 | 0 | 0 |
| 23.04.2024 04:00 - 05:00 | 0 | 0 | 0 | 0 |
| 23.04.2024 05:00 - 06:00 | 0 | 0 | 0 | 0 |
| 23.04.2024 06:00 - 07:00 | 0 | 0 | 0 | 0 |
| 23.04.2024 07:00 - 08:00 | 0 | 0 | 0 | 0 |
| 23.04.2024 08:00 - 09:00 | 0 | 0 | 0 | 0 |
| 23.04.2024 09:00 - 10:00 | 0 | 0 | 0 | 0 |
| 23.04.2024 10:00 - 11:00 | 0 | 0 | 0 | 0 |
| 23.04.2024 11:00 - 12:00 | 0 | 0 | 0 | 0 |
| 23.04.2024 12:00 - 13:00 | 0 | 0 | 0 | 0 |
| 23.04.2024 13:00 - 14:00 | 0 | 0 | 0 | 0 |
| 23.04.2024 14:00 - 15:00 | 0 | 0 | 0 | 0 |
| 23.04.2024 15:00 - 16:00 | 0 | 0 | 0 | 0 |
| 23.04.2024 16:00 - 17:00 | 0 | 0 | 0 | 0 |
| 23.04.2024 17:00 - 18:00 | 0 | 0 | 0 | 0 |
| 23.04.2024 18:00 - 19:00 | 0 | 0 | 0 | 0 |
| 23.04.2024 19:00 - 20:00 | 0 | 0 | 0 | 0 |
| 23.04.2024 20:00 - 21:00 | 0 | 0 | 0 | 0 |
| 23.04.2024 21:00 - 22:00 | 0 | 0 | 0 | 0 |
| 23.04.2024 22:00 - 23:00 | 0 | 0 | 0 | 0 |
| 23.04.2024 23:00 - 24:00 | 0 | 0 | 0 | 0 |
| 24.04.2024 00:00 - 01:00 | 0 | 0 | 0 | 0 |
| 24.04.2024 01:00 - 02:00 | 0 | 0 | 0 | 0 |
| 24.04.2024 02:00 - 03:00 | 0 | -120 | 0 | 0 |
| 24.04.2024 03:00 - 04:00 | 0 | -120 | 0 | 0 |
| 24.04.2024 04:00 - 05:00 | 0 | -120 | 0 | 0 |
| 24.04.2024 05:00 - 06:00 | 0 | -120 | 0 | 0 |
| 24.04.2024 06:00 - 07:00 | 0 | 0 | 0 | 0 |
| 24.04.2024 07:00 - 08:00 | 0 | 0 | 0 | 0 |
| 24.04.2024 08:00 - 09:00 | 0 | 0 | 0 | 0 |
| 24.04.2024 09:00 - 10:00 | 0 | 0 | 0 | 0 |
| 24.04.2024 10:00 - 11:00 | 0 | 0 | 0 | 0 |
| 24.04.2024 11:00 - 12:00 | 0 | 0 | 0 | 0 |
| 24.04.2024 12:00 - 13:00 | 0 | 0 | 0 | 0 |
| 24.04.2024 13:00 - 14:00 | 0 | 0 | 0 | 0 |
| 24.04.2024 14:00 - 15:00 | 0 | 0 | 0 | 0 |
| 24.04.2024 15:00 - 16:00 | 0 | 0 | 0 | 0 |
| 24.04.2024 16:00 - 17:00 | 0 | 0 | 0 | 0 |
| 24.04.2024 17:00 - 18:00 | 0 | 0 | 0 | 0 |
| 24.04.2024 18:00 - 19:00 | 0 | 0 | 0 | 0 |
| 24.04.2024 19:00 - 20:00 | 0 | 0 | 0 | 0 |
| 24.04.2024 20:00 - 21:00 | 0 | 0 | 0 | 0 |
| 24.04.2024 21:00 - 22:00 | 0 | 0 | 0 | 0 |
| 24.04.2024 22:00 - 23:00 | 0 | 0 | 0 | 0 |
| 24.04.2024 23:00 - 24:00 | 0 | 0 | 0 | 0 |
| 25.04.2024 00:00 - 01:00 | 0 | -200 | 0 | 0 |
| 25.04.2024 01:00 - 02:00 | 0 | -200 | 0 | 0 |
| 25.04.2024 02:00 - 03:00 | 0 | -200 | 0 | 0 |
| 25.04.2024 03:00 - 04:00 | 0 | -200 | 0 | 0 |
| 25.04.2024 04:00 - 05:00 | 0 | -200 | 0 | 0 |
| 25.04.2024 05:00 - 06:00 | 0 | -200 | 0 | 0 |
| 25.04.2024 06:00 - 07:00 | 0 | 0 | 0 | 0 |
| 25.04.2024 07:00 - 08:00 | 0 | 0 | 0 | 0 |
| 25.04.2024 08:00 - 09:00 | 0 | 0 | 0 | 0 |
| 25.04.2024 09:00 - 10:00 | 0 | 0 | 0 | 0 |
| 25.04.2024 10:00 - 11:00 | 0 | 0 | 0 | 0 |
| 25.04.2024 11:00 - 12:00 | 0 | 0 | 0 | 0 |
| 25.04.2024 12:00 - 13:00 | 0 | 0 | 0 | 0 |
| 25.04.2024 13:00 - 14:00 | 0 | 0 | 0 | 0 |
| 25.04.2024 14:00 - 15:00 | 0 | 0 | 0 | 0 |
| 25.04.2024 15:00 - 16:00 | 0 | 0 | 0 | 0 |
| 25.04.2024 16:00 - 17:00 | 0 | 0 | 0 | 0 |
| 25.04.2024 17:00 - 18:00 | 0 | 0 | 0 | 0 |
| 25.04.2024 18:00 - 19:00 | 0 | 0 | 0 | 0 |
| 25.04.2024 19:00 - 20:00 | 0 | 0 | 0 | 0 |
| 25.04.2024 20:00 - 21:00 | 0 | 0 | 0 | 0 |
| 25.04.2024 21:00 - 22:00 | 0 | -70 | 0 | 0 |
| 25.04.2024 22:00 - 23:00 | 0 | -170 | 0 | 0 |
| 25.04.2024 23:00 - 24:00 | 0 | -210 | 0 | 0 |
| 26.04.2024 00:00 - 01:00 | 0 | -210 | 0 | 0 |
| 26.04.2024 01:00 - 02:00 | 0 | -270 | 0 | 0 |
| 26.04.2024 02:00 - 03:00 | 0 | -270 | 0 | 0 |
| 26.04.2024 03:00 - 04:00 | 0 | -270 | 0 | 0 |
| 26.04.2024 04:00 - 05:00 | 0 | -270 | 0 | 0 |
| 26.04.2024 05:00 - 06:00 | 0 | -270 | 0 | 0 |
| 26.04.2024 06:00 - 07:00 | 0 | 0 | 0 | 0 |
| 26.04.2024 07:00 - 08:00 | 0 | 0 | 0 | 0 |
| 26.04.2024 08:00 - 09:00 | 0 | 0 | 0 | 0 |
| 26.04.2024 09:00 - 10:00 | 0 | 0 | 0 | 0 |
| 26.04.2024 10:00 - 11:00 | 0 | 0 | 0 | 0 |
| 26.04.2024 11:00 - 12:00 | 0 | 0 | 0 | 0 |
| 26.04.2024 12:00 - 13:00 | 0 | 0 | 0 | 0 |
| 26.04.2024 13:00 - 14:00 | 0 | 0 | 0 | 0 |
| 26.04.2024 14:00 - 15:00 | 0 | 0 | 0 | 0 |
| 26.04.2024 15:00 - 16:00 | 0 | 0 | 0 | 0 |
| 26.04.2024 16:00 - 17:00 | 0 | 0 | 0 | 0 |
| 26.04.2024 17:00 - 18:00 | 0 | 0 | 0 | 0 |
| 26.04.2024 18:00 - 19:00 | 0 | 0 | 0 | 0 |
| 26.04.2024 19:00 - 20:00 | 0 | 0 | 0 | 0 |
| 26.04.2024 20:00 - 21:00 | 0 | 0 | 0 | 0 |
| 26.04.2024 21:00 - 22:00 | 0 | 0 | 0 | 0 |
| 26.04.2024 22:00 - 23:00 | 0 | 0 | 0 | 0 |
| 26.04.2024 23:00 - 24:00 | 0 | 0 | 0 | 0 |
| 27.04.2024 00:00 - 01:00 | 0 | 0 | 0 | 0 |
| 27.04.2024 01:00 - 02:00 | 0 | 0 | 0 | 0 |
| 27.04.2024 02:00 - 03:00 | 0 | 0 | 0 | 0 |
| 27.04.2024 03:00 - 04:00 | 0 | 0 | 0 | 0 |
| 27.04.2024 04:00 - 05:00 | 0 | 0 | 0 | 0 |
| 27.04.2024 05:00 - 06:00 | 0 | 0 | 0 | 0 |
| 27.04.2024 06:00 - 07:00 | 0 | 0 | 0 | 0 |
| 27.04.2024 07:00 - 08:00 | 0 | 0 | 0 | 0 |
| 27.04.2024 08:00 - 09:00 | 0 | 0 | 0 | 0 |
| 27.04.2024 09:00 - 10:00 | 0 | 0 | 0 | 0 |
| 27.04.2024 10:00 - 11:00 | 0 | 0 | 0 | 0 |
| 27.04.2024 11:00 - 12:00 | 0 | 0 | 0 | 0 |
| 27.04.2024 12:00 - 13:00 | 0 | 0 | 0 | 0 |
| 27.04.2024 13:00 - 14:00 | 0 | 0 | 0 | 0 |
| 27.04.2024 14:00 - 15:00 | 0 | 0 | 0 | 0 |
| 27.04.2024 15:00 - 16:00 | 0 | 0 | 0 | 0 |
| 27.04.2024 16:00 - 17:00 | 0 | 0 | 0 | 0 |
| 27.04.2024 17:00 - 18:00 | 0 | 0 | 0 | 0 |
| 27.04.2024 18:00 - 19:00 | 0 | 0 | 0 | 0 |
| 27.04.2024 19:00 - 20:00 | 0 | 0 | 0 | 0 |
| 27.04.2024 20:00 - 21:00 | 0 | 0 | 0 | 0 |
| 27.04.2024 21:00 - 22:00 | 0 | 0 | 0 | 0 |
| 27.04.2024 22:00 - 23:00 | 0 | 0 | 0 | 0 |
| 27.04.2024 23:00 - 24:00 | 0 | 0 | 0 | 0 |
| 28.04.2024 00:00 - 01:00 | 0 | 0 | 0 | 0 |
| 28.04.2024 01:00 - 02:00 | 0 | 0 | 0 | 0 |
| 28.04.2024 02:00 - 03:00 | 0 | 0 | 0 | 0 |
| 28.04.2024 03:00 - 04:00 | 0 | 0 | 0 | 0 |
| 28.04.2024 04:00 - 05:00 | 0 | 0 | 0 | 0 |
| 28.04.2024 05:00 - 06:00 | 0 | 0 | 0 | 0 |
| 28.04.2024 06:00 - 07:00 | 0 | 0 | 0 | 0 |
| 28.04.2024 07:00 - 08:00 | 0 | 0 | 0 | 0 |
| 28.04.2024 08:00 - 09:00 | 0 | 0 | 0 | 0 |
| 28.04.2024 09:00 - 10:00 | 0 | 0 | 0 | 0 |
| 28.04.2024 10:00 - 11:00 | 0 | 0 | 0 | 0 |
| 28.04.2024 11:00 - 12:00 | 0 | 0 | 0 | 0 |
| 28.04.2024 12:00 - 13:00 | 0 | 0 | 0 | 0 |
| 28.04.2024 13:00 - 14:00 | 0 | 0 | 0 | 0 |
| 28.04.2024 14:00 - 15:00 | 0 | 0 | 0 | 0 |
| 28.04.2024 15:00 - 16:00 | 0 | 0 | 0 | 0 |
| 28.04.2024 16:00 - 17:00 | 0 | 0 | 0 | 0 |
| 28.04.2024 17:00 - 18:00 | 0 | 0 | 0 | 0 |
| 28.04.2024 18:00 - 19:00 | 0 | 0 | 0 | 0 |
| 28.04.2024 19:00 - 20:00 | 0 | 0 | 0 | 0 |
| 28.04.2024 20:00 - 21:00 | 0 | 0 | 0 | 0 |
| 28.04.2024 21:00 - 22:00 | 0 | 0 | 0 | 0 |
| 28.04.2024 22:00 - 23:00 | 0 | 0 | 0 | 0 |
| 28.04.2024 23:00 - 24:00 | 0 | 0 | 0 | 0 |
| 29.04.2024 00:00 - 01:00 | 0 | 0 | 0 | 0 |
| 29.04.2024 01:00 - 02:00 | 0 | 0 | 0 | 0 |
| 29.04.2024 02:00 - 03:00 | 0 | 0 | 0 | 0 |
| 29.04.2024 03:00 - 04:00 | 0 | 0 | 0 | 0 |
| 29.04.2024 04:00 - 05:00 | 0 | 0 | 0 | 0 |
| 29.04.2024 05:00 - 06:00 | 0 | 0 | 0 | 0 |
| 29.04.2024 06:00 - 07:00 | 0 | 0 | 0 | 0 |
| 29.04.2024 07:00 - 08:00 | 0 | 0 | 0 | 0 |
| 29.04.2024 08:00 - 09:00 | 0 | 0 | 0 | 0 |
| 29.04.2024 09:00 - 10:00 | 0 | 0 | 0 | 0 |
| 29.04.2024 10:00 - 11:00 | 0 | 0 | 0 | 0 |
| 29.04.2024 11:00 - 12:00 | 0 | 0 | 0 | 0 |
| 29.04.2024 12:00 - 13:00 | 0 | 0 | 0 | 0 |
| 29.04.2024 13:00 - 14:00 | 0 | 0 | 0 | 0 |
| 29.04.2024 14:00 - 15:00 | 0 | 0 | 0 | 0 |
| 29.04.2024 15:00 - 16:00 | 0 | 0 | 0 | 0 |
| 29.04.2024 16:00 - 17:00 | 0 | 0 | 0 | 0 |
| 29.04.2024 17:00 - 18:00 | 0 | 0 | 0 | 0 |
| 29.04.2024 18:00 - 19:00 | 0 | 0 | 0 | 0 |
| 29.04.2024 19:00 - 20:00 | 0 | 0 | 0 | 0 |
| 29.04.2024 20:00 - 21:00 | 0 | 0 | 0 | 0 |
| 29.04.2024 21:00 - 22:00 | 0 | 0 | 0 | 0 |
| 29.04.2024 22:00 - 23:00 | 0 | 0 | 0 | 0 |
| 29.04.2024 23:00 - 24:00 | 0 | 0 | 0 | 0 |
| 30.04.2024 00:00 - 01:00 | 0 | 0 | 0 | 0 |
| 30.04.2024 01:00 - 02:00 | 0 | 0 | 0 | 0 |
| 30.04.2024 02:00 - 03:00 | 0 | 0 | 0 | 0 |
| 30.04.2024 03:00 - 04:00 | 0 | 0 | 0 | 0 |
| 30.04.2024 04:00 - 05:00 | 0 | 0 | 0 | 0 |
| 30.04.2024 05:00 - 06:00 | 0 | 0 | 0 | 0 |
| 30.04.2024 06:00 - 07:00 | 0 | 0 | 0 | 0 |
| 30.04.2024 07:00 - 08:00 | 0 | 0 | 0 | 0 |
| 30.04.2024 08:00 - 09:00 | 0 | 0 | 0 | 0 |
| 30.04.2024 09:00 - 10:00 | 0 | 0 | 0 | 0 |
| 30.04.2024 10:00 - 11:00 | 0 | 0 | 0 | 0 |
| 30.04.2024 11:00 - 12:00 | 0 | 0 | 0 | 0 |
| 30.04.2024 12:00 - 13:00 | 0 | 0 | 0 | 0 |
| 30.04.2024 13:00 - 14:00 | 0 | 0 | 0 | 0 |
| 30.04.2024 14:00 - 15:00 | 0 | 0 | 0 | 0 |
| 30.04.2024 15:00 - 16:00 | 0 | 0 | 0 | 0 |
| 30.04.2024 16:00 - 17:00 | 0 | 0 | 0 | 0 |
| 30.04.2024 17:00 - 18:00 | 0 | 0 | 0 | 0 |
| 30.04.2024 18:00 - 19:00 | 0 | 0 | 0 | 0 |
| 30.04.2024 19:00 - 20:00 | 0 | 0 | 0 | 0 |
| 30.04.2024 20:00 - 21:00 | 0 | 0 | 0 | 0 |
| 30.04.2024 21:00 - 22:00 | 0 | 0 | 0 | 0 |
| 30.04.2024 22:00 - 23:00 | 0 | 0 | 0 | 0 |
| 30.04.2024 23:00 - 24:00 | 0 | 0 | 0 | 0 |
| 01.05.2024 00:00 - 01:00 | 0 | 0 | 0 | 0 |
| 01.05.2024 01:00 - 02:00 | 0 | 0 | 0 | 0 |
| 01.05.2024 02:00 - 03:00 | 0 | 0 | 0 | 0 |
| 01.05.2024 03:00 - 04:00 | 0 | 0 | 0 | 0 |
| 01.05.2024 04:00 - 05:00 | 0 | 0 | 0 | 0 |
| 01.05.2024 05:00 - 06:00 | 0 | 0 | 0 | 0 |